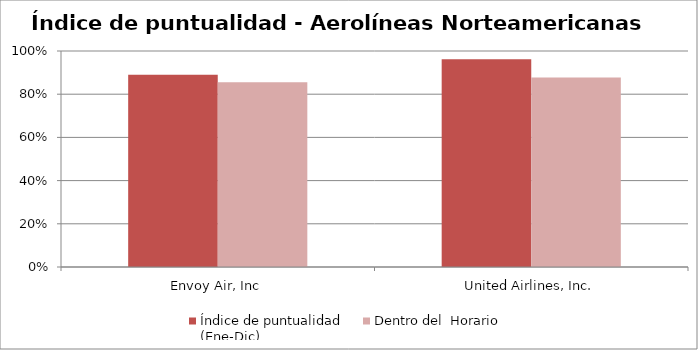
| Category | Índice de puntualidad
(Ene-Dic) | Dentro del  Horario |
|---|---|---|
| Envoy Air, Inc | 0.89 | 0.856 |
| United Airlines, Inc. | 0.962 | 0.877 |